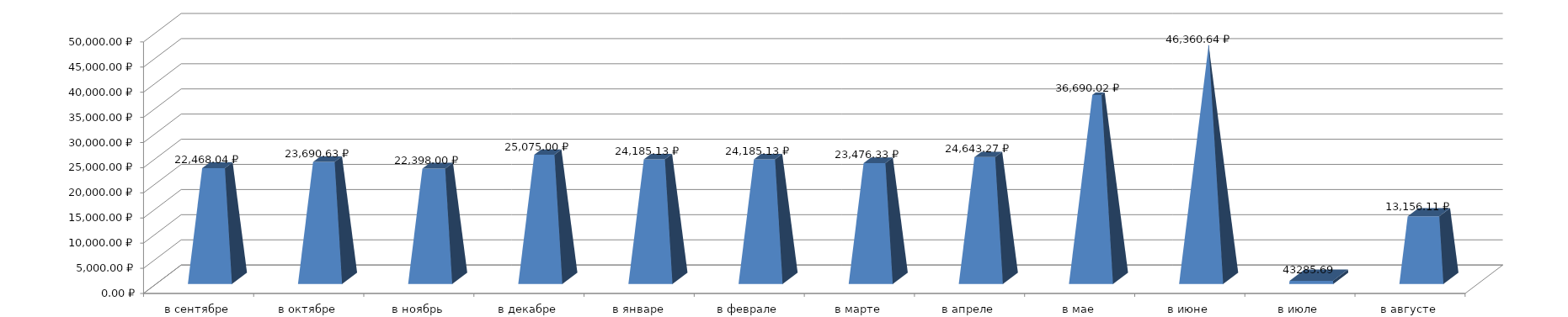
| Category | Series 0 |
|---|---|
| в сентябре | 22468.04 |
| в октябре | 23690.63 |
| в ноябрь | 22398 |
| в декабре | 25075 |
| в январе | 24185.13 |
| в феврале | 24185.13 |
| в марте | 23476.33 |
| в апреле | 24643.27 |
| в мае | 36690.02 |
| в июне | 46360.64 |
| в июле | 631.5 |
| в августе | 13156.11 |